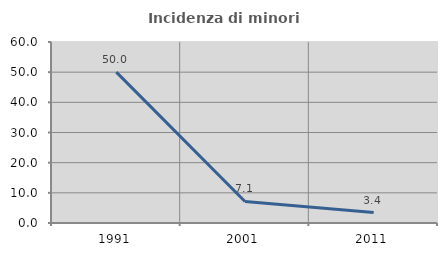
| Category | Incidenza di minori stranieri |
|---|---|
| 1991.0 | 50 |
| 2001.0 | 7.143 |
| 2011.0 | 3.448 |